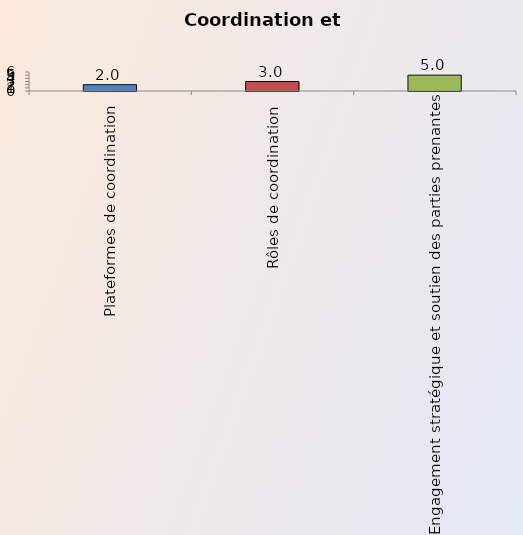
| Category | Series 0 |
|---|---|
| Plateformes de coordination | 2 |
| Rôles de coordination | 3 |
| Engagement stratégique et soutien des parties prenantes | 5 |